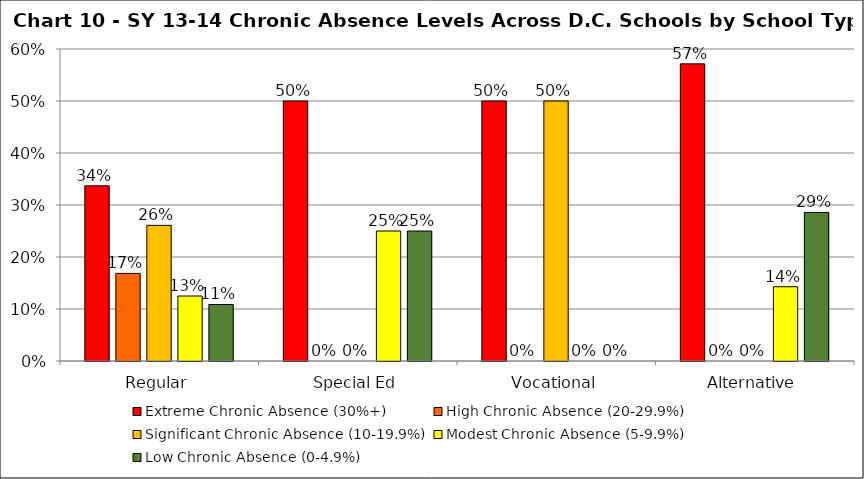
| Category | Extreme Chronic Absence (30%+) | High Chronic Absence (20-29.9%) | Significant Chronic Absence (10-19.9%) | Modest Chronic Absence (5-9.9%) | Low Chronic Absence (0-4.9%) |
|---|---|---|---|---|---|
| 0 | 0.337 | 0.168 | 0.261 | 0.125 | 0.109 |
| 1 | 0.5 | 0 | 0 | 0.25 | 0.25 |
| 2 | 0.5 | 0 | 0.5 | 0 | 0 |
| 3 | 0.571 | 0 | 0 | 0.143 | 0.286 |